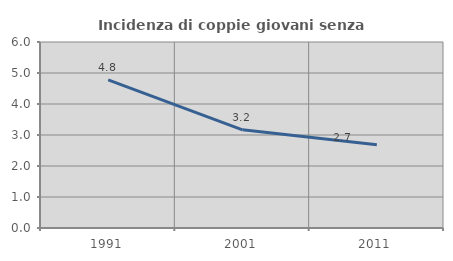
| Category | Incidenza di coppie giovani senza figli |
|---|---|
| 1991.0 | 4.775 |
| 2001.0 | 3.168 |
| 2011.0 | 2.686 |